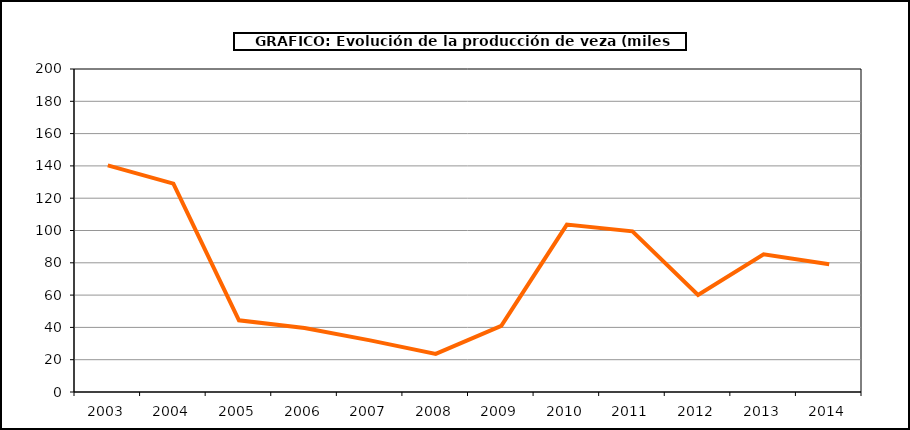
| Category | Producción |
|---|---|
| 2003.0 | 140.282 |
| 2004.0 | 129.008 |
| 2005.0 | 44.4 |
| 2006.0 | 39.622 |
| 2007.0 | 31.948 |
| 2008.0 | 23.563 |
| 2009.0 | 40.979 |
| 2010.0 | 103.681 |
| 2011.0 | 99.503 |
| 2012.0 | 60.1 |
| 2013.0 | 85.3 |
| 2014.0 | 79.043 |